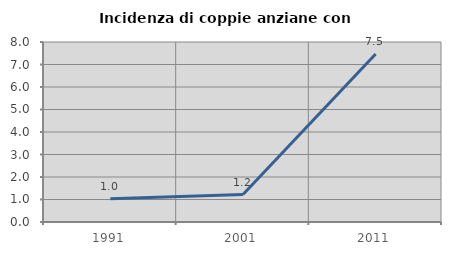
| Category | Incidenza di coppie anziane con figli |
|---|---|
| 1991.0 | 1.031 |
| 2001.0 | 1.22 |
| 2011.0 | 7.463 |